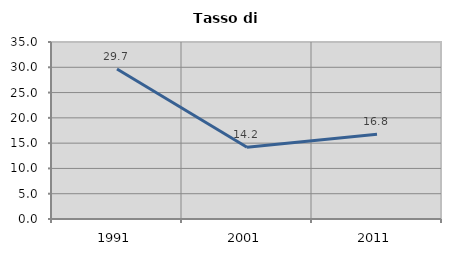
| Category | Tasso di disoccupazione   |
|---|---|
| 1991.0 | 29.655 |
| 2001.0 | 14.184 |
| 2011.0 | 16.779 |